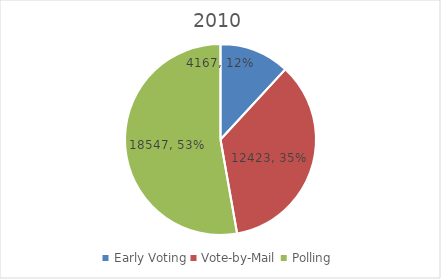
| Category | Series 0 |
|---|---|
| Early Voting | 4167 |
| Vote-by-Mail | 12423 |
| Polling | 18547 |